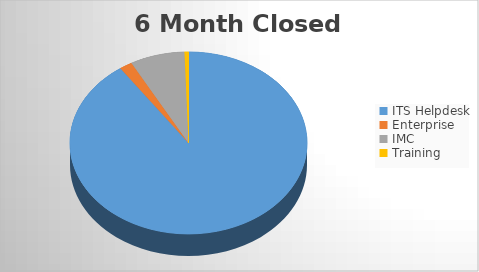
| Category | 6M Closed | 6M Opened |
|---|---|---|
| ITS Helpdesk | 2477 | 2456 |
| Enterprise | 48 | 42 |
| IMC | 204 | 204 |
| Training | 15 | 15 |